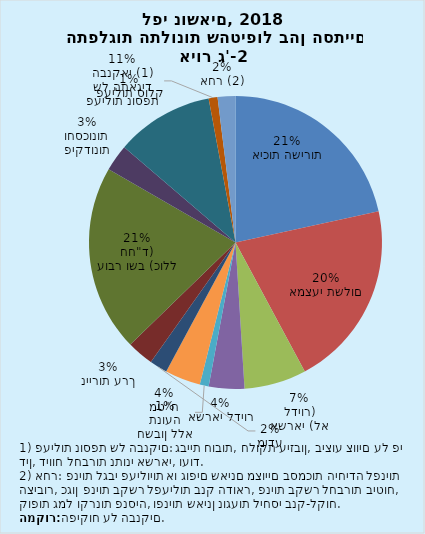
| Category | Series 0 |
|---|---|
| איכות השירות | 22 |
| אמצעי תשלום | 21 |
| אשראי (לא לדיור) | 7 |
| אשראי לדיור | 4 |
| חשבון ללא תנועה | 1 |
| מט"ח | 4 |
| מידע | 2 |
| ניירות ערך | 3 |
| עובר ושב (כולל חח"ד) | 21 |
| פיקדונות וחסכונות | 3 |
| פעילות נוספת של התאגיד הבנקאי (1) | 11 |
| פעילות סולק | 1 |
| אחר (2) | 2 |